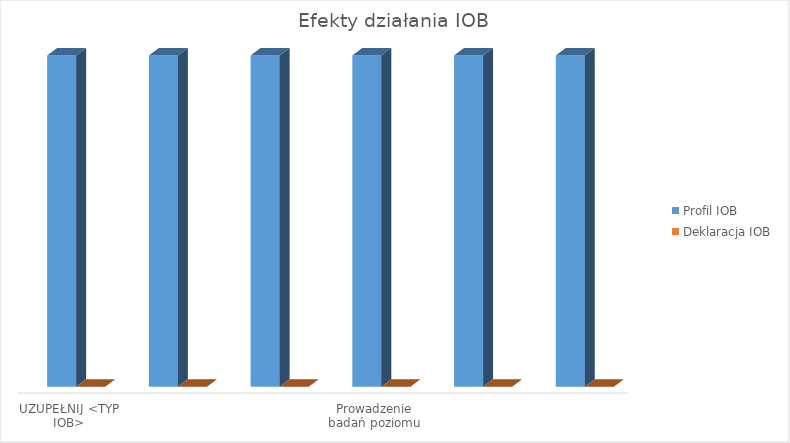
| Category | Profil IOB | Deklaracja IOB |
|---|---|---|
| UZUPEŁNIJ <TYP IOB> | 1 | 0 |
| Minimum 60% usług doradczych to usługi prorozwojowe | 1 | 0 |
| Posiadanie referencji, potwierdzeń dot. jakości usług | 1 | 0 |
| Prowadzenie badań poziomu zaspokojenia potrzeb | 1 | 0 |
| Prowadzenie odroczonych badań skuteczności usług | 1 | 0 |
| Posiadanie i wdrożenie procedury obsługi reklamacji | 1 | 0 |